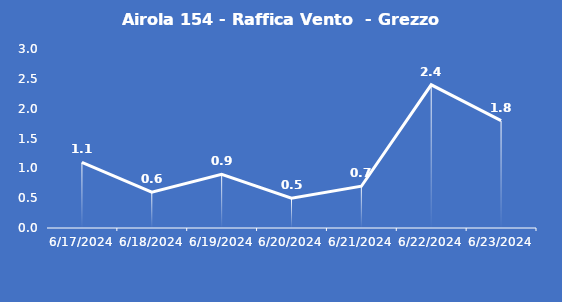
| Category | Airola 154 - Raffica Vento  - Grezzo (m/s) |
|---|---|
| 6/17/24 | 1.1 |
| 6/18/24 | 0.6 |
| 6/19/24 | 0.9 |
| 6/20/24 | 0.5 |
| 6/21/24 | 0.7 |
| 6/22/24 | 2.4 |
| 6/23/24 | 1.8 |